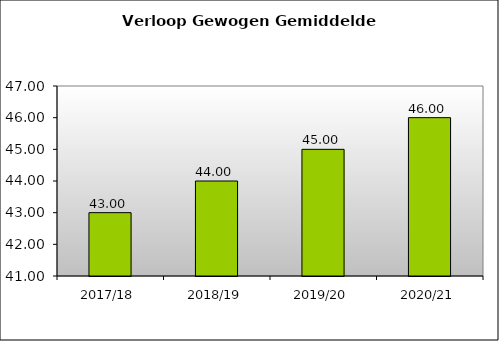
| Category | Series 0 |
|---|---|
| 2017/18 | 43 |
| 2018/19 | 44 |
| 2019/20 | 45 |
| 2020/21 | 46 |